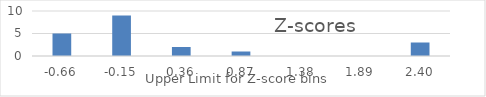
| Category | Series 0 |
|---|---|
| -0.6640194255915297 | 5 |
| -0.15417650053660828 | 9 |
| 0.35566642451831315 | 2 |
| 0.8655093495732346 | 1 |
| 1.3753522746281561 | 0 |
| 1.8851951996830776 | 0 |
| 2.395038124737999 | 3 |